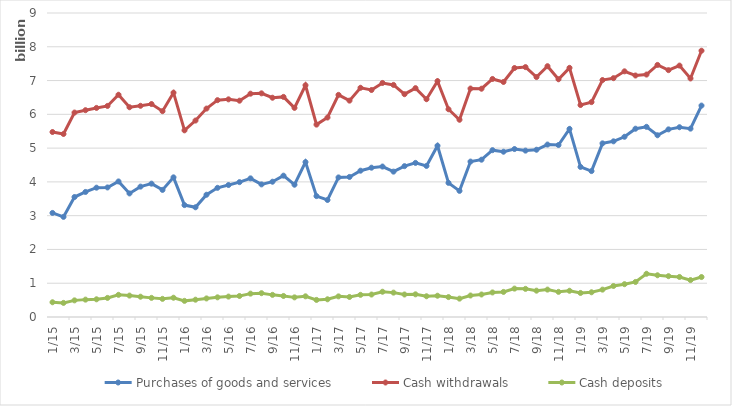
| Category | Purchases of goods and services | Cash withdrawals | Cash deposits |
|---|---|---|---|
| 2015-01-01 | 3080564316 | 5476843516 | 436617439 |
| 2015-02-01 | 2964313470 | 5418434882 | 417287822 |
| 2015-03-01 | 3552104565 | 6052489543 | 492464658 |
| 2015-04-01 | 3702068050 | 6122379943 | 514337992 |
| 2015-05-01 | 3828574763 | 6190017708 | 524095603 |
| 2015-06-01 | 3835521387 | 6248662051 | 565129556 |
| 2015-07-01 | 4012894534 | 6579631148 | 656316630 |
| 2015-08-01 | 3658519203 | 6209743784 | 633884976 |
| 2015-09-01 | 3859902726 | 6252505593 | 600857451 |
| 2015-10-01 | 3947769268 | 6305183969 | 566211452 |
| 2015-11-01 | 3762645579 | 6093796652 | 536946459 |
| 2015-12-01 | 4134324224 | 6641008685 | 570373441 |
| 2016-01-01 | 3313356181 | 5526440661 | 477949973 |
| 2016-02-01 | 3248269214 | 5816226861 | 512324963 |
| 2016-03-01 | 3619679238 | 6169984547 | 549662940 |
| 2016-04-01 | 3823999818 | 6419433107 | 582376393 |
| 2016-05-01 | 3907500543 | 6443747480 | 604150152 |
| 2016-06-01 | 3992803732 | 6404009850 | 622163959 |
| 2016-07-01 | 4104443392 | 6611263838 | 691690069 |
| 2016-08-01 | 3925959988 | 6621351165 | 705232805 |
| 2016-09-01 | 4005295393 | 6491524452 | 655447842 |
| 2016-10-01 | 4184310295 | 6516178632 | 622806180 |
| 2016-11-01 | 3916622974 | 6192076994 | 581315199 |
| 2016-12-01 | 4585676699 | 6860960168 | 612347745 |
| 2017-01-01 | 3579431859 | 5695813057 | 505971477 |
| 2017-02-01 | 3465062471 | 5905650526 | 524298023 |
| 2017-03-01 | 4132110078 | 6576518594 | 610672899 |
| 2017-04-01 | 4146194627 | 6405698115 | 593283764 |
| 2017-05-01 | 4331545466 | 6786132607 | 656245703 |
| 2017-06-01 | 4420401084 | 6720272792 | 665286210 |
| 2017-07-01 | 4454191914 | 6928847609 | 747986708 |
| 2017-08-01 | 4303812338 | 6870895799 | 721612254 |
| 2017-09-01 | 4466017428 | 6596491946 | 666343648 |
| 2017-10-01 | 4562095306 | 6775597691 | 671478223 |
| 2017-11-01 | 4472506453 | 6447912948 | 614247461 |
| 2017-12-01 | 5070421627 | 6983850032 | 629795691 |
| 2018-01-01 | 3970761857 | 6150362166 | 589626186 |
| 2018-02-01 | 3733864233 | 5839573308 | 543621541 |
| 2018-03-01 | 4601099257 | 6763550284 | 636323928 |
| 2018-04-01 | 4656855796 | 6758416318 | 666318190 |
| 2018-05-01 | 4939643042 | 7046946339 | 727001511 |
| 2018-06-01 | 4893590961 | 6958546377 | 742529375 |
| 2018-07-01 | 4972659540 | 7371645378 | 840639109 |
| 2018-08-01 | 4926174170 | 7398539225 | 833062337 |
| 2018-09-01 | 4951898400 | 7103767194 | 779834670 |
| 2018-10-01 | 5105376765 | 7425052401 | 811243501 |
| 2018-11-01 | 5091284082 | 7038340122 | 744465124 |
| 2018-12-01 | 5567481107 | 7376065076 | 776815255 |
| 2019-01-01 | 4442907364 | 6275899917 | 711926385 |
| 2019-02-01 | 4320140350 | 6362058436 | 732202511 |
| 2019-03-01 | 5140700342 | 7015376109 | 810345480 |
| 2019-04-01 | 5200880169 | 7071002942 | 918546770 |
| 2019-05-01 | 5335825539 | 7273046006 | 971493355 |
| 2019-06-01 | 5574421491 | 7149231768 | 1037709822 |
| 2019-07-01 | 5630367051 | 7178062210 | 1279840153 |
| 2019-08-01 | 5380446332 | 7462486991 | 1235675585 |
| 2019-09-01 | 5554968525 | 7308487837 | 1208971161 |
| 2019-10-01 | 5618367099 | 7443204522 | 1185647618 |
| 2019-11-01 | 5576230333 | 7062691220 | 1093097042 |
| 2019-12-01 | 6259150208 | 7883134692 | 1183230457 |